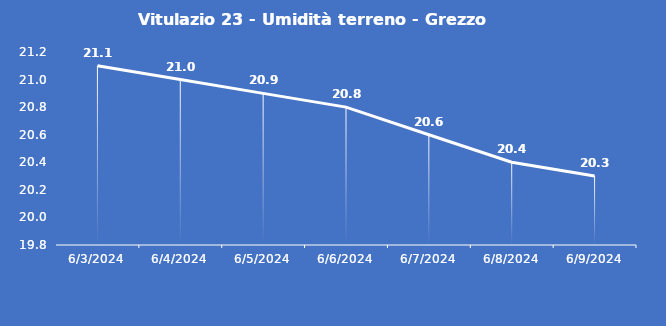
| Category | Vitulazio 23 - Umidità terreno - Grezzo (%VWC) |
|---|---|
| 6/3/24 | 21.1 |
| 6/4/24 | 21 |
| 6/5/24 | 20.9 |
| 6/6/24 | 20.8 |
| 6/7/24 | 20.6 |
| 6/8/24 | 20.4 |
| 6/9/24 | 20.3 |